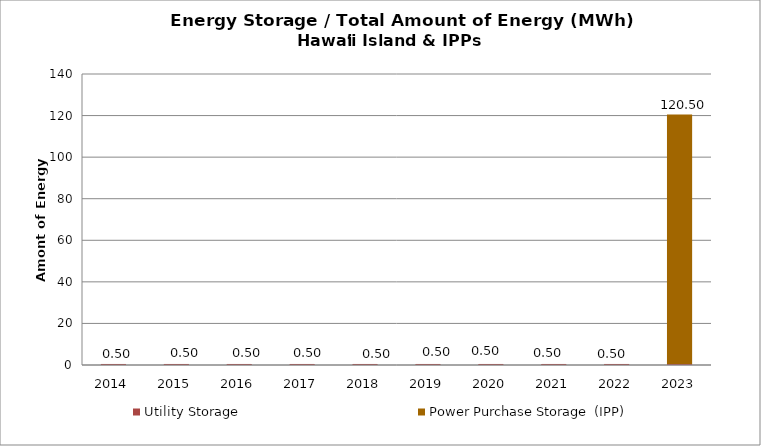
| Category | Utility Storage | Power Purchase Storage  (IPP) |
|---|---|---|
| 2014.0 | 0.498 | 0 |
| 2015.0 | 0.498 | 0 |
| 2016.0 | 0.498 | 0 |
| 2017.0 | 0.498 | 0 |
| 2018.0 | 0.498 | 0 |
| 2019.0 | 0.498 | 0 |
| 2020.0 | 0.498 | 0 |
| 2021.0 | 0.498 | 0 |
| 2022.0 | 0.498 | 0 |
| 2023.0 | 0.498 | 120 |